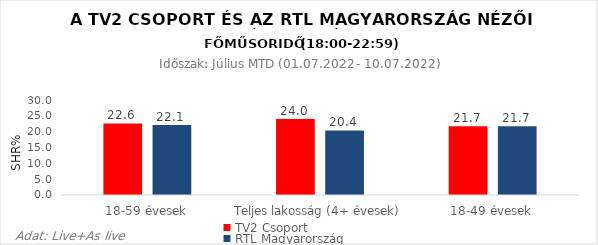
| Category | TV2 Csoport | RTL Magyarország |
|---|---|---|
| 18-59 évesek | 22.6 | 22.1 |
| Teljes lakosság (4+ évesek) | 24 | 20.4 |
| 18-49 évesek | 21.7 | 21.7 |